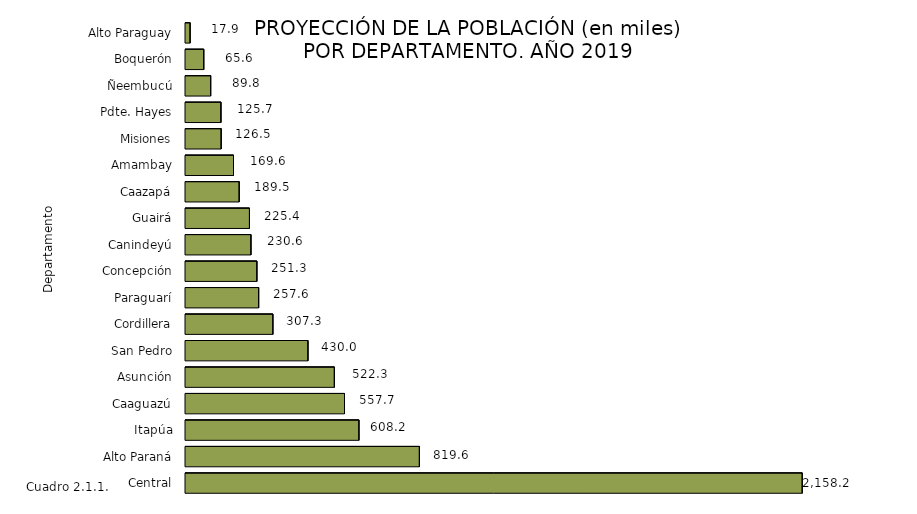
| Category | Series 0 |
|---|---|
| Central | 2158.215 |
| Alto Paraná | 819.589 |
| Itapúa | 608.215 |
| Caaguazú | 557.733 |
| Asunción | 522.287 |
| San Pedro | 429.957 |
| Cordillera | 307.256 |
| Paraguarí | 257.587 |
| Concepción | 251.314 |
| Canindeyú | 230.556 |
| Guairá | 225.41 |
| Caazapá | 189.541 |
| Amambay | 169.615 |
| Misiones | 126.517 |
| Pdte. Hayes | 125.658 |
| Ñeembucú | 89.794 |
| Boquerón | 65.572 |
| Alto Paraguay | 17.886 |